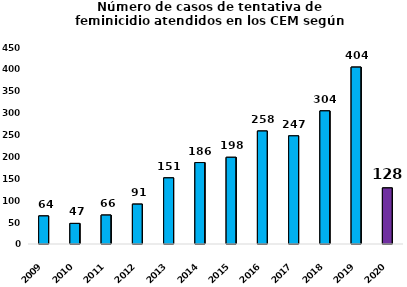
| Category | Tentativa de feminicidio |
|---|---|
| 2009.0 | 64 |
| 2010.0 | 47 |
| 2011.0 | 66 |
| 2012.0 | 91 |
| 2013.0 | 151 |
| 2014.0 | 186 |
| 2015.0 | 198 |
| 2016.0 | 258 |
| 2017.0 | 247 |
| 2018.0 | 304 |
| 2019.0 | 404 |
| 2020.0 | 128 |